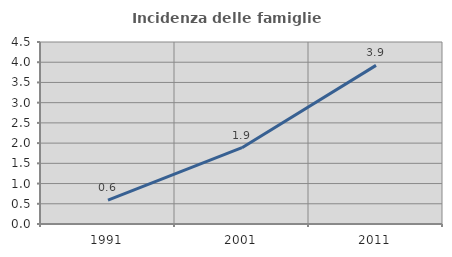
| Category | Incidenza delle famiglie numerose |
|---|---|
| 1991.0 | 0.592 |
| 2001.0 | 1.887 |
| 2011.0 | 3.922 |